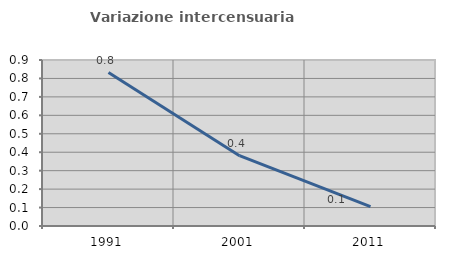
| Category | Variazione intercensuaria annua |
|---|---|
| 1991.0 | 0.832 |
| 2001.0 | 0.381 |
| 2011.0 | 0.105 |